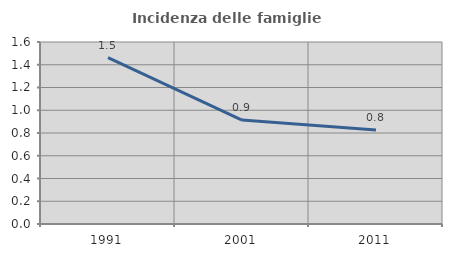
| Category | Incidenza delle famiglie numerose |
|---|---|
| 1991.0 | 1.463 |
| 2001.0 | 0.913 |
| 2011.0 | 0.826 |